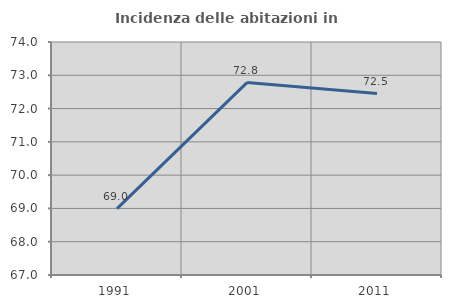
| Category | Incidenza delle abitazioni in proprietà  |
|---|---|
| 1991.0 | 68.996 |
| 2001.0 | 72.78 |
| 2011.0 | 72.451 |